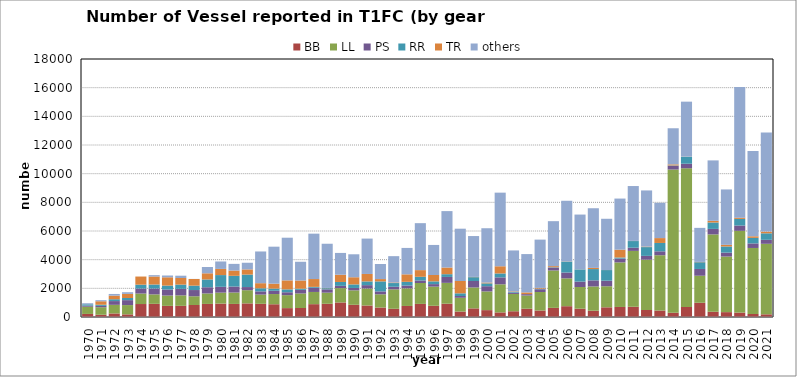
| Category | BB | LL | PS | RR | TR | others |
|---|---|---|---|---|---|---|
| 1970.0 | 214 | 503 | 79 | 91 | 0 | 74 |
| 1971.0 | 157 | 526 | 94 | 79 | 242 | 75 |
| 1972.0 | 247 | 602 | 262 | 129 | 250 | 117 |
| 1973.0 | 184 | 648 | 344 | 151 | 284 | 118 |
| 1974.0 | 905 | 731 | 350 | 269 | 568 | 0 |
| 1975.0 | 918 | 660 | 410 | 279 | 558 | 95 |
| 1976.0 | 776 | 720 | 422 | 274 | 578 | 125 |
| 1977.0 | 778 | 731 | 455 | 296 | 461 | 160 |
| 1978.0 | 838 | 608 | 435 | 306 | 465 | 5 |
| 1979.0 | 912 | 730 | 434 | 544 | 429 | 441 |
| 1980.0 | 935 | 765 | 406 | 819 | 430 | 519 |
| 1981.0 | 912 | 795 | 420 | 746 | 367 | 466 |
| 1982.0 | 950 | 920 | 220 | 870 | 361 | 464 |
| 1983.0 | 919 | 644 | 226 | 215 | 355 | 2213 |
| 1984.0 | 890 | 712 | 228 | 151 | 345 | 2580 |
| 1985.0 | 620 | 904 | 203 | 201 | 628 | 2976 |
| 1986.0 | 627 | 1014 | 252 | 83 | 571 | 1307 |
| 1987.0 | 896 | 851 | 295 | 59 | 547 | 3167 |
| 1988.0 | 921 | 776 | 233 | 81 | 16 | 3084 |
| 1989.0 | 1014 | 1001 | 160 | 269 | 505 | 1521 |
| 1990.0 | 851 | 1008 | 167 | 248 | 500 | 1602 |
| 1991.0 | 803 | 1185 | 235 | 260 | 519 | 2469 |
| 1992.0 | 661 | 921 | 205 | 698 | 161 | 1053 |
| 1993.0 | 573 | 1356 | 182 | 258 | 38 | 1838 |
| 1994.0 | 770 | 1228 | 198 | 258 | 523 | 1842 |
| 1995.0 | 914 | 1459 | 177 | 255 | 466 | 3276 |
| 1996.0 | 782 | 1337 | 176 | 192 | 444 | 2096 |
| 1997.0 | 927 | 1455 | 413 | 192 | 465 | 3936 |
| 1998.0 | 381 | 960 | 125 | 186 | 860 | 3649 |
| 1999.0 | 602 | 1459 | 452 | 266 | 18 | 2851 |
| 2000.0 | 480 | 1304 | 365 | 197 | 58 | 3789 |
| 2001.0 | 322 | 1958 | 485 | 274 | 501 | 5136 |
| 2002.0 | 401 | 1208 | 93 | 63 | 32 | 2847 |
| 2003.0 | 578 | 922 | 96 | 0 | 119 | 2675 |
| 2004.0 | 453 | 1293 | 190 | 41 | 53 | 3369 |
| 2005.0 | 637 | 2609 | 201 | 27 | 75 | 3137 |
| 2006.0 | 754 | 1942 | 407 | 764 | 13 | 4229 |
| 2007.0 | 580 | 1512 | 377 | 852 | 5 | 3821 |
| 2008.0 | 439 | 1692 | 424 | 789 | 83 | 4161 |
| 2009.0 | 676 | 1469 | 388 | 742 | 5 | 3573 |
| 2010.0 | 700 | 3109 | 264 | 78 | 546 | 3566 |
| 2011.0 | 714 | 3898 | 223 | 464 | 10 | 3828 |
| 2012.0 | 488 | 3513 | 264 | 612 | 35 | 3918 |
| 2013.0 | 451 | 3858 | 274 | 582 | 341 | 2459 |
| 2014.0 | 298 | 9991 | 260 | 26 | 74 | 2519 |
| 2015.0 | 704 | 9672 | 318 | 489 | 8 | 3833 |
| 2016.0 | 993 | 1886 | 472 | 471 | 22 | 2375 |
| 2017.0 | 366 | 5397 | 384 | 447 | 117 | 4215 |
| 2018.0 | 340 | 3877 | 274 | 430 | 114 | 3865 |
| 2019.0 | 308 | 5703 | 371 | 462 | 84 | 9119 |
| 2020.0 | 211 | 4605 | 318 | 386 | 112 | 5958 |
| 2021.0 | 187 | 4919 | 279 | 454 | 118 | 6909 |